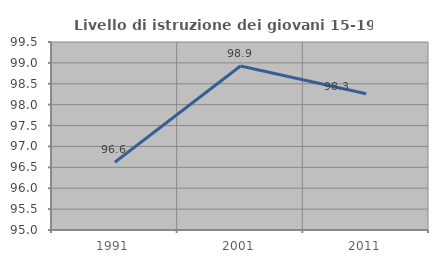
| Category | Livello di istruzione dei giovani 15-19 anni |
|---|---|
| 1991.0 | 96.622 |
| 2001.0 | 98.925 |
| 2011.0 | 98.261 |